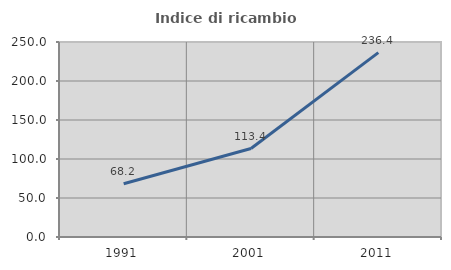
| Category | Indice di ricambio occupazionale  |
|---|---|
| 1991.0 | 68.238 |
| 2001.0 | 113.445 |
| 2011.0 | 236.421 |